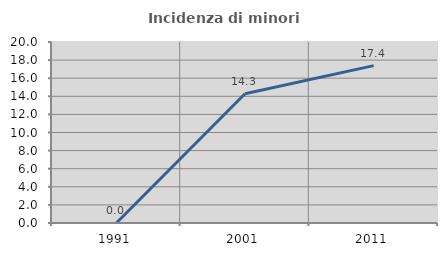
| Category | Incidenza di minori stranieri |
|---|---|
| 1991.0 | 0 |
| 2001.0 | 14.286 |
| 2011.0 | 17.391 |